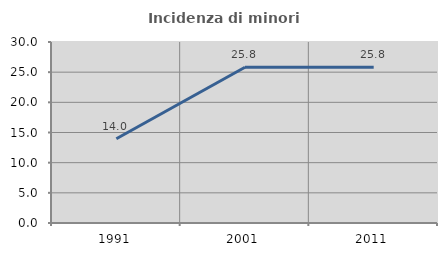
| Category | Incidenza di minori stranieri |
|---|---|
| 1991.0 | 13.965 |
| 2001.0 | 25.809 |
| 2011.0 | 25.798 |